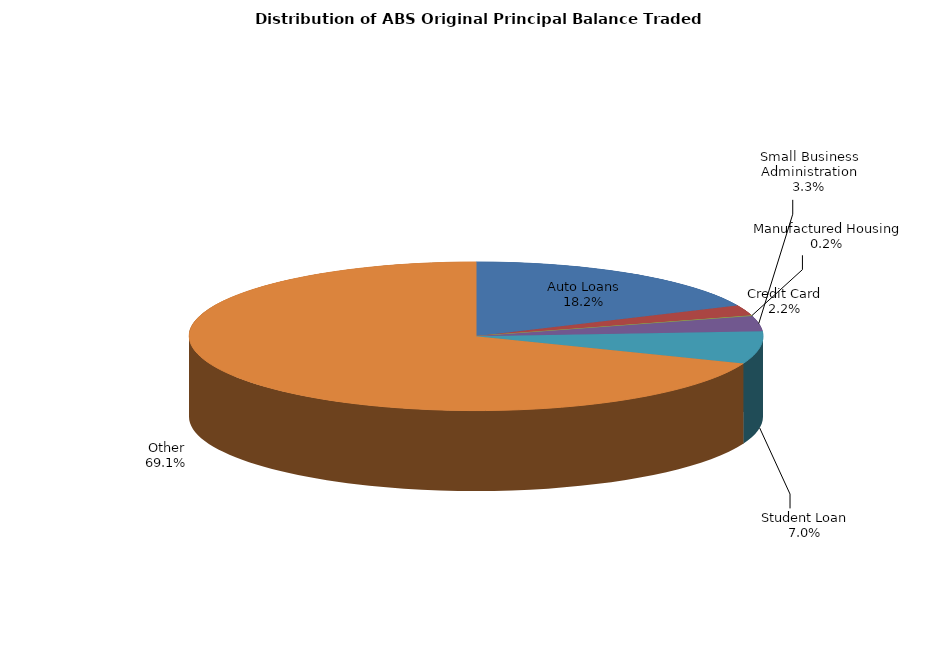
| Category | Series 0 |
|---|---|
| Auto Loans | 459565910.744 |
| Credit Card | 56538494.802 |
| Manufactured Housing | 3911902.683 |
| Small Business Administration | 82995567.115 |
| Student Loan | 177686029.679 |
| Other | 1742383993.526 |